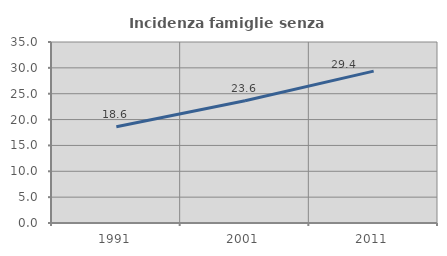
| Category | Incidenza famiglie senza nuclei |
|---|---|
| 1991.0 | 18.612 |
| 2001.0 | 23.629 |
| 2011.0 | 29.362 |